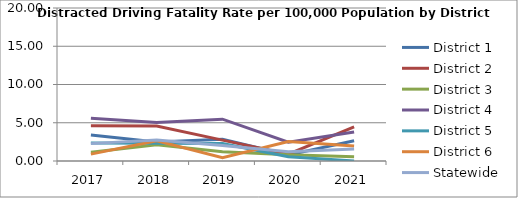
| Category | District 1 | District 2 | District 3 | District 4 | District 5 | District 6 | Statewide |
|---|---|---|---|---|---|---|---|
| 2017.0 | 3.407 | 4.607 | 1.147 | 5.592 | 2.355 | 0.9 | 2.271 |
| 2018.0 | 2.498 | 4.559 | 2.107 | 5.023 | 2.319 | 2.654 | 2.736 |
| 2019.0 | 2.847 | 2.733 | 1.21 | 5.472 | 2.299 | 0.435 | 2.014 |
| 2020.0 | 0.792 | 0.9 | 0.824 | 2.451 | 0.569 | 2.558 | 1.204 |
| 2021.0 | 2.638 | 4.448 | 0.569 | 3.792 | 0 | 1.954 | 1.578 |